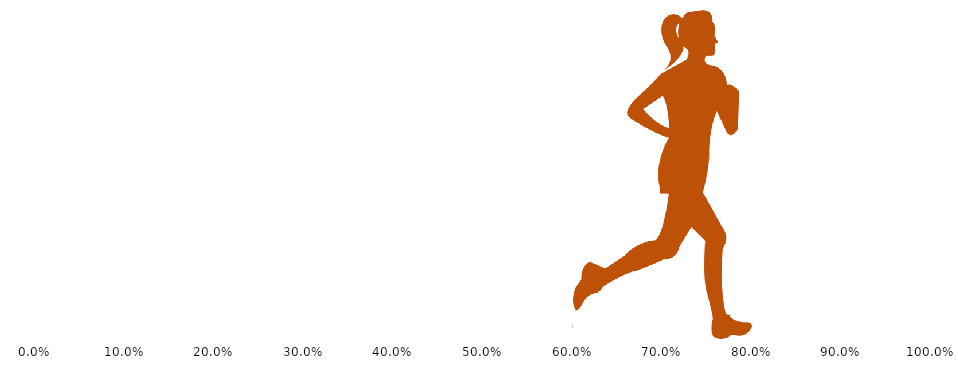
| Category | Main | IS | Rest Ar |
|---|---|---|---|
| 0 | 0.6 | 0.2 | 0.4 |